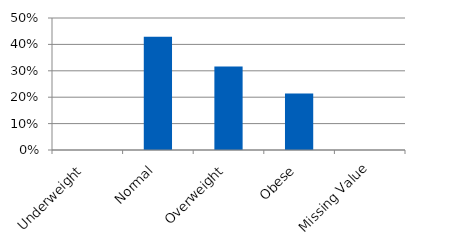
| Category | Total |
|---|---|
| Underweight | 0 |
| Normal | 0.429 |
| Overweight | 0.316 |
| Obese | 0.214 |
| Missing Value | 0 |